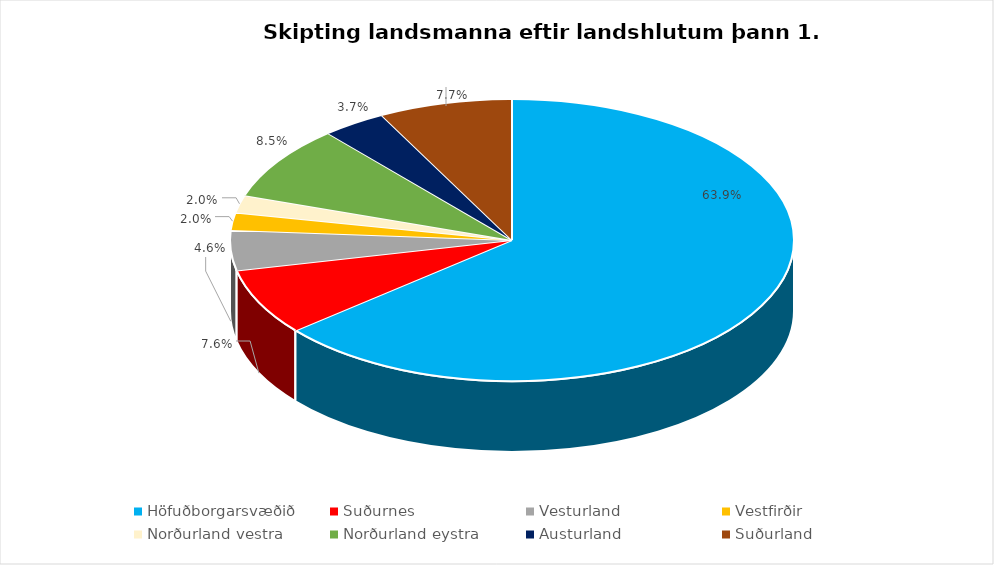
| Category | Series 0 |
|---|---|
| Höfuðborgarsvæðið | 0.639 |
| Suðurnes  | 0.076 |
| Vesturland | 0.046 |
| Vestfirðir  | 0.02 |
| Norðurland vestra | 0.02 |
| Norðurland eystra | 0.085 |
| Austurland | 0.037 |
| Suðurland | 0.077 |